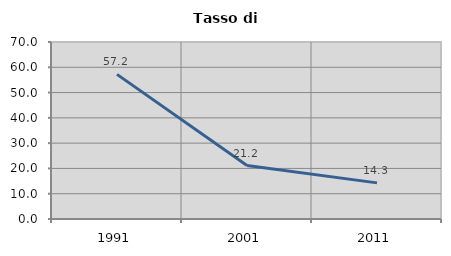
| Category | Tasso di disoccupazione   |
|---|---|
| 1991.0 | 57.2 |
| 2001.0 | 21.154 |
| 2011.0 | 14.286 |